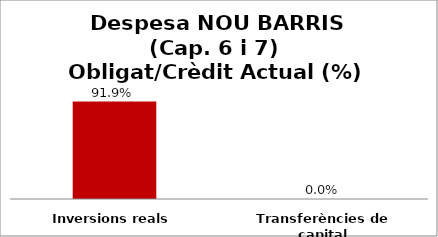
| Category | Series 0 |
|---|---|
| Inversions reals | 0.919 |
| Transferències de capital | 0 |